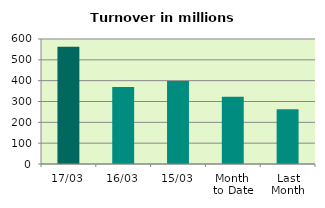
| Category | Series 0 |
|---|---|
| 17/03 | 563.148 |
| 16/03 | 369.749 |
| 15/03 | 398.806 |
| Month 
to Date | 322.779 |
| Last
Month | 263.32 |